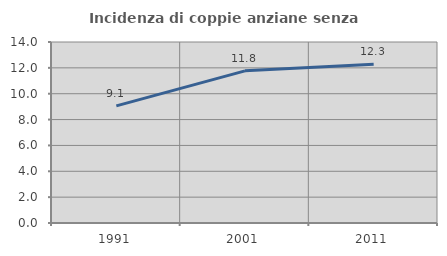
| Category | Incidenza di coppie anziane senza figli  |
|---|---|
| 1991.0 | 9.056 |
| 2001.0 | 11.77 |
| 2011.0 | 12.284 |